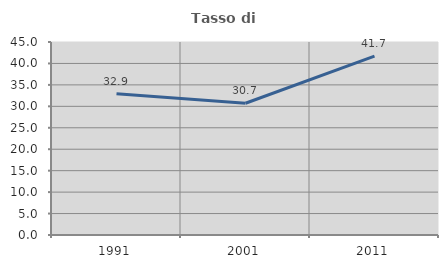
| Category | Tasso di occupazione   |
|---|---|
| 1991.0 | 32.909 |
| 2001.0 | 30.716 |
| 2011.0 | 41.727 |